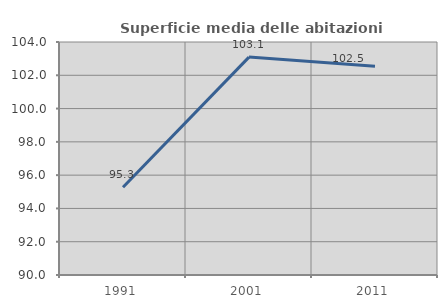
| Category | Superficie media delle abitazioni occupate |
|---|---|
| 1991.0 | 95.275 |
| 2001.0 | 103.093 |
| 2011.0 | 102.544 |